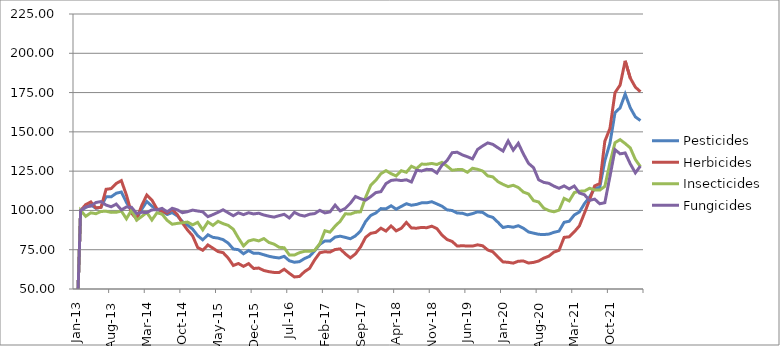
| Category | Pesticides | Herbicides | Insecticides | Fungicides |
|---|---|---|---|---|
| 2013-01-01 | 0 | 0 | 0 | 0 |
| 2013-02-01 | 100 | 100 | 100 | 100 |
| 2013-03-01 | 101.86 | 103.73 | 96.25 | 102.25 |
| 2013-04-01 | 103.54 | 105.41 | 98.49 | 102.75 |
| 2013-05-01 | 101.38 | 101.6 | 97.91 | 105.04 |
| 2013-06-01 | 102.05 | 101.95 | 99.35 | 105.64 |
| 2013-07-01 | 108.75 | 113.45 | 99.47 | 103.4 |
| 2013-08-01 | 108.66 | 113.89 | 98.76 | 102.31 |
| 2013-09-01 | 110.93 | 117.17 | 98.83 | 104.03 |
| 2013-10-01 | 111.72 | 118.97 | 99.58 | 100.36 |
| 2013-11-01 | 105.11 | 109.76 | 94.68 | 102.2 |
| 2013-12-01 | 99.53 | 98.22 | 100.2 | 101.97 |
| 2014-01-01 | 94.86 | 94.59 | 93.82 | 98.06 |
| 2014-02-01 | 100.72 | 103.14 | 96.13 | 98.83 |
| 2014-03-01 | 105.69 | 109.79 | 98.7 | 98.63 |
| 2014-04-01 | 102.75 | 106.62 | 93.91 | 100.34 |
| 2014-05-01 | 100.53 | 100.97 | 98.5 | 100.39 |
| 2014-06-01 | 99.51 | 99.46 | 97.63 | 101.31 |
| 2014-07-01 | 97.42 | 98.22 | 93.67 | 99.09 |
| 2014-08-01 | 98.62 | 100.75 | 91.21 | 101.37 |
| 2014-09-01 | 96.54 | 97.31 | 91.76 | 100.36 |
| 2014-10-01 | 92.9 | 92 | 92.16 | 98.55 |
| 2014-11-01 | 90.7 | 87.56 | 92.62 | 99.2 |
| 2014-12-01 | 88.11 | 83.84 | 90.83 | 100.2 |
| 2015-01-01 | 83.95 | 76.41 | 92.43 | 99.62 |
| 2015-02-01 | 81.28 | 74.64 | 87.63 | 99.13 |
| 2015-03-01 | 84.5 | 78.02 | 92.66 | 96.01 |
| 2015-04-01 | 82.86 | 75.97 | 90.49 | 97.33 |
| 2015-05-01 | 82.39 | 73.84 | 93.06 | 98.81 |
| 2015-06-01 | 81.39 | 73.1 | 91.59 | 100.4 |
| 2015-07-01 | 79.19 | 69.65 | 90.49 | 98.48 |
| 2015-08-01 | 75.45 | 64.97 | 88.01 | 96.63 |
| 2015-09-01 | 75.01 | 66.23 | 82.45 | 98.49 |
| 2015-10-01 | 72.43 | 64.4 | 77.42 | 97.33 |
| 2015-11-01 | 74.47 | 66.15 | 80.55 | 98.52 |
| 2015-12-01 | 72.72 | 63.05 | 81.42 | 97.76 |
| 2016-01-01 | 72.74 | 63.33 | 80.62 | 98.22 |
| 2016-02-01 | 71.79 | 61.77 | 82.09 | 97.09 |
| 2016-03-01 | 70.83 | 61.03 | 79.6 | 96.34 |
| 2016-04-01 | 70.17 | 60.53 | 78.56 | 95.74 |
| 2016-05-01 | 69.75 | 60.5 | 76.56 | 96.68 |
| 2016-06-01 | 70.78 | 62.58 | 76.25 | 97.52 |
| 2016-07-01 | 67.98 | 60.01 | 71.69 | 95.2 |
| 2016-08-01 | 67.02 | 57.65 | 71.6 | 98.8 |
| 2016-09-01 | 67.4 | 58.01 | 73.11 | 97.11 |
| 2016-10-01 | 69.38 | 61.05 | 74.01 | 96.4 |
| 2016-11-01 | 70.83 | 63.2 | 73.98 | 97.58 |
| 2016-12-01 | 74.36 | 68.62 | 74.66 | 98 |
| 2017-01-01 | 78.44 | 73.06 | 78.89 | 100.07 |
| 2017-02-01 | 80.58 | 73.72 | 87.07 | 98.41 |
| 2017-03-01 | 80.46 | 73.47 | 86.19 | 99.08 |
| 2017-04-01 | 83.03 | 75.11 | 89.97 | 103.4 |
| 2017-05-01 | 83.62 | 75.55 | 93.12 | 99.68 |
| 2017-06-01 | 82.85 | 72.35 | 97.87 | 101.32 |
| 2017-07-01 | 81.98 | 69.8 | 97.67 | 104.56 |
| 2017-08-01 | 83.79 | 72.33 | 98.85 | 108.87 |
| 2017-09-01 | 86.97 | 76.76 | 99.11 | 107.47 |
| 2017-10-01 | 92.97 | 82.89 | 108.32 | 106.55 |
| 2017-11-01 | 96.82 | 85.43 | 116.02 | 108.78 |
| 2017-12-01 | 98.36 | 86.04 | 119.16 | 111.35 |
| 2018-01-01 | 101.16 | 88.71 | 123.39 | 111.94 |
| 2018-02-01 | 101.01 | 86.86 | 125.32 | 117.07 |
| 2018-03-01 | 102.96 | 90.09 | 123.38 | 119.08 |
| 2018-04-01 | 100.78 | 87.02 | 121.94 | 119.48 |
| 2018-05-01 | 102.54 | 88.59 | 125.28 | 119 |
| 2018-06-01 | 104.28 | 92.36 | 124.28 | 119.49 |
| 2018-07-01 | 103.29 | 88.83 | 128.1 | 118.08 |
| 2018-08-01 | 103.83 | 88.69 | 126.62 | 125.54 |
| 2018-09-01 | 104.83 | 89.19 | 129.48 | 125.12 |
| 2018-10-01 | 104.84 | 89 | 129.43 | 126.15 |
| 2018-11-01 | 105.53 | 89.97 | 129.9 | 126 |
| 2018-12-01 | 104.14 | 88.45 | 129.25 | 123.79 |
| 2019-01-01 | 102.69 | 84.31 | 130.6 | 128.81 |
| 2019-02-01 | 100.36 | 81.5 | 128.2 | 131.74 |
| 2019-03-01 | 99.95 | 80.24 | 125.56 | 136.74 |
| 2019-04-01 | 98.33 | 77.33 | 125.97 | 137.04 |
| 2019-05-01 | 98.22 | 77.53 | 125.99 | 135.32 |
| 2019-06-01 | 97.16 | 77.35 | 124.26 | 134.17 |
| 2019-07-01 | 97.97 | 77.31 | 126.84 | 132.8 |
| 2019-08-01 | 99.09 | 78.12 | 126.15 | 138.83 |
| 2019-09-01 | 98.72 | 77.49 | 125.05 | 141.05 |
| 2019-10-01 | 96.57 | 74.82 | 121.98 | 142.98 |
| 2019-11-01 | 95.57 | 73.68 | 121.34 | 142.02 |
| 2019-12-01 | 92.44 | 70.31 | 118.29 | 139.86 |
| 2020-01-01 | 89.14 | 67.24 | 116.56 | 137.78 |
| 2020-02-01 | 89.83 | 67 | 115.16 | 144.2 |
| 2020-03-01 | 89.31 | 66.46 | 116 | 138.36 |
| 2020-04-01 | 90.27 | 67.69 | 114.59 | 142.72 |
| 2020-05-01 | 88.67 | 67.81 | 111.68 | 135.91 |
| 2020-06-01 | 86.31 | 66.54 | 110.49 | 129.97 |
| 2020-07-01 | 85.53 | 66.94 | 106.2 | 127.19 |
| 2020-08-01 | 84.8 | 67.82 | 105.38 | 119.47 |
| 2020-09-01 | 84.65 | 69.62 | 101.45 | 117.85 |
| 2020-10-01 | 84.94 | 70.9 | 99.88 | 117.25 |
| 2020-11-01 | 86.06 | 73.49 | 99.11 | 115.46 |
| 2020-12-01 | 86.84 | 74.62 | 100.2 | 114.08 |
| 2021-01-01 | 92.44 | 82.86 | 107.66 | 115.6 |
| 2021-02-01 | 93.1 | 83.2 | 106.03 | 113.7 |
| 2021-03-01 | 97.1 | 86.39 | 111.35 | 115.53 |
| 2021-04-01 | 99.01 | 90.14 | 112.27 | 111.11 |
| 2021-05-01 | 104.34 | 98.32 | 112.32 | 109.98 |
| 2021-06-01 | 108.46 | 106.76 | 114.1 | 106.37 |
| 2021-07-01 | 114.14 | 115.61 | 113.07 | 107.2 |
| 2021-08-01 | 114.58 | 117.06 | 112.93 | 104.23 |
| 2021-09-01 | 131.63 | 144.02 | 115.28 | 104.92 |
| 2021-10-02 | 142.67 | 152.11 | 130.16 | 121.53 |
| 2021-11-03 | 162.2 | 174.93 | 143.1 | 138.66 |
| 2021-12-03 | 165.28 | 179.75 | 145.06 | 136.01 |
| 2022-01-03 | 174.07 | 195.2 | 142.57 | 136.57 |
| 2022-02-03 | 165.33 | 184.23 | 139.8 | 129.63 |
| 2022-03-03 | 159.55 | 178.46 | 132.39 | 123.92 |
| 2022-04-04 | 157.17 | 175.53 | 127.84 | 128.27 |